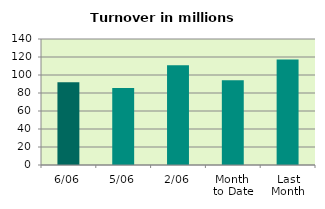
| Category | Series 0 |
|---|---|
| 6/06 | 92.051 |
| 5/06 | 85.573 |
| 2/06 | 110.946 |
| Month 
to Date | 94.074 |
| Last
Month | 117.306 |